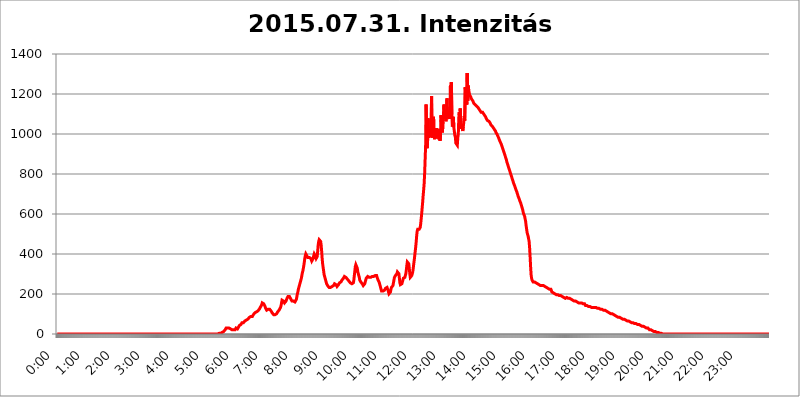
| Category | 2015.07.31. Intenzitás [W/m^2] |
|---|---|
| 0.0 | 0 |
| 0.0006944444444444445 | 0 |
| 0.001388888888888889 | 0 |
| 0.0020833333333333333 | 0 |
| 0.002777777777777778 | 0 |
| 0.003472222222222222 | 0 |
| 0.004166666666666667 | 0 |
| 0.004861111111111111 | 0 |
| 0.005555555555555556 | 0 |
| 0.0062499999999999995 | 0 |
| 0.006944444444444444 | 0 |
| 0.007638888888888889 | 0 |
| 0.008333333333333333 | 0 |
| 0.009027777777777779 | 0 |
| 0.009722222222222222 | 0 |
| 0.010416666666666666 | 0 |
| 0.011111111111111112 | 0 |
| 0.011805555555555555 | 0 |
| 0.012499999999999999 | 0 |
| 0.013194444444444444 | 0 |
| 0.013888888888888888 | 0 |
| 0.014583333333333332 | 0 |
| 0.015277777777777777 | 0 |
| 0.015972222222222224 | 0 |
| 0.016666666666666666 | 0 |
| 0.017361111111111112 | 0 |
| 0.018055555555555557 | 0 |
| 0.01875 | 0 |
| 0.019444444444444445 | 0 |
| 0.02013888888888889 | 0 |
| 0.020833333333333332 | 0 |
| 0.02152777777777778 | 0 |
| 0.022222222222222223 | 0 |
| 0.02291666666666667 | 0 |
| 0.02361111111111111 | 0 |
| 0.024305555555555556 | 0 |
| 0.024999999999999998 | 0 |
| 0.025694444444444447 | 0 |
| 0.02638888888888889 | 0 |
| 0.027083333333333334 | 0 |
| 0.027777777777777776 | 0 |
| 0.02847222222222222 | 0 |
| 0.029166666666666664 | 0 |
| 0.029861111111111113 | 0 |
| 0.030555555555555555 | 0 |
| 0.03125 | 0 |
| 0.03194444444444445 | 0 |
| 0.03263888888888889 | 0 |
| 0.03333333333333333 | 0 |
| 0.034027777777777775 | 0 |
| 0.034722222222222224 | 0 |
| 0.035416666666666666 | 0 |
| 0.036111111111111115 | 0 |
| 0.03680555555555556 | 0 |
| 0.0375 | 0 |
| 0.03819444444444444 | 0 |
| 0.03888888888888889 | 0 |
| 0.03958333333333333 | 0 |
| 0.04027777777777778 | 0 |
| 0.04097222222222222 | 0 |
| 0.041666666666666664 | 0 |
| 0.042361111111111106 | 0 |
| 0.04305555555555556 | 0 |
| 0.043750000000000004 | 0 |
| 0.044444444444444446 | 0 |
| 0.04513888888888889 | 0 |
| 0.04583333333333334 | 0 |
| 0.04652777777777778 | 0 |
| 0.04722222222222222 | 0 |
| 0.04791666666666666 | 0 |
| 0.04861111111111111 | 0 |
| 0.049305555555555554 | 0 |
| 0.049999999999999996 | 0 |
| 0.05069444444444445 | 0 |
| 0.051388888888888894 | 0 |
| 0.052083333333333336 | 0 |
| 0.05277777777777778 | 0 |
| 0.05347222222222222 | 0 |
| 0.05416666666666667 | 0 |
| 0.05486111111111111 | 0 |
| 0.05555555555555555 | 0 |
| 0.05625 | 0 |
| 0.05694444444444444 | 0 |
| 0.057638888888888885 | 0 |
| 0.05833333333333333 | 0 |
| 0.05902777777777778 | 0 |
| 0.059722222222222225 | 0 |
| 0.06041666666666667 | 0 |
| 0.061111111111111116 | 0 |
| 0.06180555555555556 | 0 |
| 0.0625 | 0 |
| 0.06319444444444444 | 0 |
| 0.06388888888888888 | 0 |
| 0.06458333333333334 | 0 |
| 0.06527777777777778 | 0 |
| 0.06597222222222222 | 0 |
| 0.06666666666666667 | 0 |
| 0.06736111111111111 | 0 |
| 0.06805555555555555 | 0 |
| 0.06874999999999999 | 0 |
| 0.06944444444444443 | 0 |
| 0.07013888888888889 | 0 |
| 0.07083333333333333 | 0 |
| 0.07152777777777779 | 0 |
| 0.07222222222222223 | 0 |
| 0.07291666666666667 | 0 |
| 0.07361111111111111 | 0 |
| 0.07430555555555556 | 0 |
| 0.075 | 0 |
| 0.07569444444444444 | 0 |
| 0.0763888888888889 | 0 |
| 0.07708333333333334 | 0 |
| 0.07777777777777778 | 0 |
| 0.07847222222222222 | 0 |
| 0.07916666666666666 | 0 |
| 0.0798611111111111 | 0 |
| 0.08055555555555556 | 0 |
| 0.08125 | 0 |
| 0.08194444444444444 | 0 |
| 0.08263888888888889 | 0 |
| 0.08333333333333333 | 0 |
| 0.08402777777777777 | 0 |
| 0.08472222222222221 | 0 |
| 0.08541666666666665 | 0 |
| 0.08611111111111112 | 0 |
| 0.08680555555555557 | 0 |
| 0.08750000000000001 | 0 |
| 0.08819444444444445 | 0 |
| 0.08888888888888889 | 0 |
| 0.08958333333333333 | 0 |
| 0.09027777777777778 | 0 |
| 0.09097222222222222 | 0 |
| 0.09166666666666667 | 0 |
| 0.09236111111111112 | 0 |
| 0.09305555555555556 | 0 |
| 0.09375 | 0 |
| 0.09444444444444444 | 0 |
| 0.09513888888888888 | 0 |
| 0.09583333333333333 | 0 |
| 0.09652777777777777 | 0 |
| 0.09722222222222222 | 0 |
| 0.09791666666666667 | 0 |
| 0.09861111111111111 | 0 |
| 0.09930555555555555 | 0 |
| 0.09999999999999999 | 0 |
| 0.10069444444444443 | 0 |
| 0.1013888888888889 | 0 |
| 0.10208333333333335 | 0 |
| 0.10277777777777779 | 0 |
| 0.10347222222222223 | 0 |
| 0.10416666666666667 | 0 |
| 0.10486111111111111 | 0 |
| 0.10555555555555556 | 0 |
| 0.10625 | 0 |
| 0.10694444444444444 | 0 |
| 0.1076388888888889 | 0 |
| 0.10833333333333334 | 0 |
| 0.10902777777777778 | 0 |
| 0.10972222222222222 | 0 |
| 0.1111111111111111 | 0 |
| 0.11180555555555556 | 0 |
| 0.11180555555555556 | 0 |
| 0.1125 | 0 |
| 0.11319444444444444 | 0 |
| 0.11388888888888889 | 0 |
| 0.11458333333333333 | 0 |
| 0.11527777777777777 | 0 |
| 0.11597222222222221 | 0 |
| 0.11666666666666665 | 0 |
| 0.1173611111111111 | 0 |
| 0.11805555555555557 | 0 |
| 0.11944444444444445 | 0 |
| 0.12013888888888889 | 0 |
| 0.12083333333333333 | 0 |
| 0.12152777777777778 | 0 |
| 0.12222222222222223 | 0 |
| 0.12291666666666667 | 0 |
| 0.12291666666666667 | 0 |
| 0.12361111111111112 | 0 |
| 0.12430555555555556 | 0 |
| 0.125 | 0 |
| 0.12569444444444444 | 0 |
| 0.12638888888888888 | 0 |
| 0.12708333333333333 | 0 |
| 0.16875 | 0 |
| 0.12847222222222224 | 0 |
| 0.12916666666666668 | 0 |
| 0.12986111111111112 | 0 |
| 0.13055555555555556 | 0 |
| 0.13125 | 0 |
| 0.13194444444444445 | 0 |
| 0.1326388888888889 | 0 |
| 0.13333333333333333 | 0 |
| 0.13402777777777777 | 0 |
| 0.13402777777777777 | 0 |
| 0.13472222222222222 | 0 |
| 0.13541666666666666 | 0 |
| 0.1361111111111111 | 0 |
| 0.13749999999999998 | 0 |
| 0.13819444444444443 | 0 |
| 0.1388888888888889 | 0 |
| 0.13958333333333334 | 0 |
| 0.14027777777777778 | 0 |
| 0.14097222222222222 | 0 |
| 0.14166666666666666 | 0 |
| 0.1423611111111111 | 0 |
| 0.14305555555555557 | 0 |
| 0.14375000000000002 | 0 |
| 0.14444444444444446 | 0 |
| 0.1451388888888889 | 0 |
| 0.1451388888888889 | 0 |
| 0.14652777777777778 | 0 |
| 0.14722222222222223 | 0 |
| 0.14791666666666667 | 0 |
| 0.1486111111111111 | 0 |
| 0.14930555555555555 | 0 |
| 0.15 | 0 |
| 0.15069444444444444 | 0 |
| 0.15138888888888888 | 0 |
| 0.15208333333333332 | 0 |
| 0.15277777777777776 | 0 |
| 0.15347222222222223 | 0 |
| 0.15416666666666667 | 0 |
| 0.15486111111111112 | 0 |
| 0.15555555555555556 | 0 |
| 0.15625 | 0 |
| 0.15694444444444444 | 0 |
| 0.15763888888888888 | 0 |
| 0.15833333333333333 | 0 |
| 0.15902777777777777 | 0 |
| 0.15972222222222224 | 0 |
| 0.16041666666666668 | 0 |
| 0.16111111111111112 | 0 |
| 0.16180555555555556 | 0 |
| 0.1625 | 0 |
| 0.16319444444444445 | 0 |
| 0.1638888888888889 | 0 |
| 0.16458333333333333 | 0 |
| 0.16527777777777777 | 0 |
| 0.16597222222222222 | 0 |
| 0.16666666666666666 | 0 |
| 0.1673611111111111 | 0 |
| 0.16805555555555554 | 0 |
| 0.16874999999999998 | 0 |
| 0.16944444444444443 | 0 |
| 0.17013888888888887 | 0 |
| 0.1708333333333333 | 0 |
| 0.17152777777777775 | 0 |
| 0.17222222222222225 | 0 |
| 0.1729166666666667 | 0 |
| 0.17361111111111113 | 0 |
| 0.17430555555555557 | 0 |
| 0.17500000000000002 | 0 |
| 0.17569444444444446 | 0 |
| 0.1763888888888889 | 0 |
| 0.17708333333333334 | 0 |
| 0.17777777777777778 | 0 |
| 0.17847222222222223 | 0 |
| 0.17916666666666667 | 0 |
| 0.1798611111111111 | 0 |
| 0.18055555555555555 | 0 |
| 0.18125 | 0 |
| 0.18194444444444444 | 0 |
| 0.1826388888888889 | 0 |
| 0.18333333333333335 | 0 |
| 0.1840277777777778 | 0 |
| 0.18472222222222223 | 0 |
| 0.18541666666666667 | 0 |
| 0.18611111111111112 | 0 |
| 0.18680555555555556 | 0 |
| 0.1875 | 0 |
| 0.18819444444444444 | 0 |
| 0.18888888888888888 | 0 |
| 0.18958333333333333 | 0 |
| 0.19027777777777777 | 0 |
| 0.1909722222222222 | 0 |
| 0.19166666666666665 | 0 |
| 0.19236111111111112 | 0 |
| 0.19305555555555554 | 0 |
| 0.19375 | 0 |
| 0.19444444444444445 | 0 |
| 0.1951388888888889 | 0 |
| 0.19583333333333333 | 0 |
| 0.19652777777777777 | 0 |
| 0.19722222222222222 | 0 |
| 0.19791666666666666 | 0 |
| 0.1986111111111111 | 0 |
| 0.19930555555555554 | 0 |
| 0.19999999999999998 | 0 |
| 0.20069444444444443 | 0 |
| 0.20138888888888887 | 0 |
| 0.2020833333333333 | 0 |
| 0.2027777777777778 | 0 |
| 0.2034722222222222 | 0 |
| 0.2041666666666667 | 0 |
| 0.20486111111111113 | 0 |
| 0.20555555555555557 | 0 |
| 0.20625000000000002 | 0 |
| 0.20694444444444446 | 0 |
| 0.2076388888888889 | 0 |
| 0.20833333333333334 | 0 |
| 0.20902777777777778 | 0 |
| 0.20972222222222223 | 0 |
| 0.21041666666666667 | 0 |
| 0.2111111111111111 | 0 |
| 0.21180555555555555 | 0 |
| 0.2125 | 0 |
| 0.21319444444444444 | 0 |
| 0.2138888888888889 | 0 |
| 0.21458333333333335 | 0 |
| 0.2152777777777778 | 0 |
| 0.21597222222222223 | 0 |
| 0.21666666666666667 | 0 |
| 0.21736111111111112 | 0 |
| 0.21805555555555556 | 0 |
| 0.21875 | 0 |
| 0.21944444444444444 | 0 |
| 0.22013888888888888 | 0 |
| 0.22083333333333333 | 0 |
| 0.22152777777777777 | 0 |
| 0.2222222222222222 | 0 |
| 0.22291666666666665 | 0 |
| 0.2236111111111111 | 0 |
| 0.22430555555555556 | 0 |
| 0.225 | 0 |
| 0.22569444444444445 | 0 |
| 0.2263888888888889 | 0 |
| 0.22708333333333333 | 3.525 |
| 0.22777777777777777 | 3.525 |
| 0.22847222222222222 | 3.525 |
| 0.22916666666666666 | 3.525 |
| 0.2298611111111111 | 3.525 |
| 0.23055555555555554 | 3.525 |
| 0.23124999999999998 | 7.887 |
| 0.23194444444444443 | 7.887 |
| 0.23263888888888887 | 7.887 |
| 0.2333333333333333 | 12.257 |
| 0.2340277777777778 | 12.257 |
| 0.2347222222222222 | 16.636 |
| 0.2354166666666667 | 21.024 |
| 0.23611111111111113 | 25.419 |
| 0.23680555555555557 | 29.823 |
| 0.23750000000000002 | 29.823 |
| 0.23819444444444446 | 29.823 |
| 0.2388888888888889 | 29.823 |
| 0.23958333333333334 | 29.823 |
| 0.24027777777777778 | 29.823 |
| 0.24097222222222223 | 29.823 |
| 0.24166666666666667 | 29.823 |
| 0.2423611111111111 | 25.419 |
| 0.24305555555555555 | 25.419 |
| 0.24375 | 21.024 |
| 0.24444444444444446 | 25.419 |
| 0.24513888888888888 | 21.024 |
| 0.24583333333333335 | 21.024 |
| 0.2465277777777778 | 21.024 |
| 0.24722222222222223 | 21.024 |
| 0.24791666666666667 | 21.024 |
| 0.24861111111111112 | 21.024 |
| 0.24930555555555556 | 21.024 |
| 0.25 | 25.419 |
| 0.25069444444444444 | 29.823 |
| 0.2513888888888889 | 29.823 |
| 0.2520833333333333 | 25.419 |
| 0.25277777777777777 | 25.419 |
| 0.2534722222222222 | 29.823 |
| 0.25416666666666665 | 34.234 |
| 0.2548611111111111 | 38.653 |
| 0.2555555555555556 | 43.079 |
| 0.25625000000000003 | 43.079 |
| 0.2569444444444445 | 47.511 |
| 0.2576388888888889 | 47.511 |
| 0.25833333333333336 | 51.951 |
| 0.2590277777777778 | 56.398 |
| 0.25972222222222224 | 56.398 |
| 0.2604166666666667 | 56.398 |
| 0.2611111111111111 | 56.398 |
| 0.26180555555555557 | 60.85 |
| 0.2625 | 60.85 |
| 0.26319444444444445 | 65.31 |
| 0.2638888888888889 | 65.31 |
| 0.26458333333333334 | 65.31 |
| 0.2652777777777778 | 69.775 |
| 0.2659722222222222 | 69.775 |
| 0.26666666666666666 | 74.246 |
| 0.2673611111111111 | 74.246 |
| 0.26805555555555555 | 78.722 |
| 0.26875 | 78.722 |
| 0.26944444444444443 | 83.205 |
| 0.2701388888888889 | 83.205 |
| 0.2708333333333333 | 83.205 |
| 0.27152777777777776 | 87.692 |
| 0.2722222222222222 | 87.692 |
| 0.27291666666666664 | 87.692 |
| 0.2736111111111111 | 87.692 |
| 0.2743055555555555 | 92.184 |
| 0.27499999999999997 | 96.682 |
| 0.27569444444444446 | 101.184 |
| 0.27638888888888885 | 101.184 |
| 0.27708333333333335 | 105.69 |
| 0.2777777777777778 | 110.201 |
| 0.27847222222222223 | 110.201 |
| 0.2791666666666667 | 110.201 |
| 0.2798611111111111 | 110.201 |
| 0.28055555555555556 | 114.716 |
| 0.28125 | 114.716 |
| 0.28194444444444444 | 119.235 |
| 0.2826388888888889 | 119.235 |
| 0.2833333333333333 | 123.758 |
| 0.28402777777777777 | 128.284 |
| 0.2847222222222222 | 128.284 |
| 0.28541666666666665 | 137.347 |
| 0.28611111111111115 | 141.884 |
| 0.28680555555555554 | 146.423 |
| 0.28750000000000003 | 155.509 |
| 0.2881944444444445 | 155.509 |
| 0.2888888888888889 | 155.509 |
| 0.28958333333333336 | 150.964 |
| 0.2902777777777778 | 146.423 |
| 0.29097222222222224 | 141.884 |
| 0.2916666666666667 | 137.347 |
| 0.2923611111111111 | 128.284 |
| 0.29305555555555557 | 123.758 |
| 0.29375 | 119.235 |
| 0.29444444444444445 | 119.235 |
| 0.2951388888888889 | 123.758 |
| 0.29583333333333334 | 123.758 |
| 0.2965277777777778 | 123.758 |
| 0.2972222222222222 | 123.758 |
| 0.29791666666666666 | 123.758 |
| 0.2986111111111111 | 123.758 |
| 0.29930555555555555 | 119.235 |
| 0.3 | 114.716 |
| 0.30069444444444443 | 110.201 |
| 0.3013888888888889 | 105.69 |
| 0.3020833333333333 | 101.184 |
| 0.30277777777777776 | 101.184 |
| 0.3034722222222222 | 96.682 |
| 0.30416666666666664 | 96.682 |
| 0.3048611111111111 | 96.682 |
| 0.3055555555555555 | 96.682 |
| 0.30624999999999997 | 96.682 |
| 0.3069444444444444 | 101.184 |
| 0.3076388888888889 | 101.184 |
| 0.30833333333333335 | 105.69 |
| 0.3090277777777778 | 110.201 |
| 0.30972222222222223 | 114.716 |
| 0.3104166666666667 | 114.716 |
| 0.3111111111111111 | 119.235 |
| 0.31180555555555556 | 119.235 |
| 0.3125 | 123.758 |
| 0.31319444444444444 | 132.814 |
| 0.3138888888888889 | 141.884 |
| 0.3145833333333333 | 155.509 |
| 0.31527777777777777 | 169.156 |
| 0.3159722222222222 | 173.709 |
| 0.31666666666666665 | 173.709 |
| 0.31736111111111115 | 164.605 |
| 0.31805555555555554 | 160.056 |
| 0.31875000000000003 | 155.509 |
| 0.3194444444444445 | 155.509 |
| 0.3201388888888889 | 160.056 |
| 0.32083333333333336 | 164.605 |
| 0.3215277777777778 | 169.156 |
| 0.32222222222222224 | 178.264 |
| 0.3229166666666667 | 182.82 |
| 0.3236111111111111 | 187.378 |
| 0.32430555555555557 | 191.937 |
| 0.325 | 191.937 |
| 0.32569444444444445 | 187.378 |
| 0.3263888888888889 | 187.378 |
| 0.32708333333333334 | 182.82 |
| 0.3277777777777778 | 173.709 |
| 0.3284722222222222 | 169.156 |
| 0.32916666666666666 | 164.605 |
| 0.3298611111111111 | 164.605 |
| 0.33055555555555555 | 164.605 |
| 0.33125 | 164.605 |
| 0.33194444444444443 | 160.056 |
| 0.3326388888888889 | 160.056 |
| 0.3333333333333333 | 160.056 |
| 0.3340277777777778 | 160.056 |
| 0.3347222222222222 | 164.605 |
| 0.3354166666666667 | 173.709 |
| 0.3361111111111111 | 187.378 |
| 0.3368055555555556 | 201.058 |
| 0.33749999999999997 | 210.182 |
| 0.33819444444444446 | 223.873 |
| 0.33888888888888885 | 233 |
| 0.33958333333333335 | 242.127 |
| 0.34027777777777773 | 251.251 |
| 0.34097222222222223 | 260.373 |
| 0.3416666666666666 | 269.49 |
| 0.3423611111111111 | 278.603 |
| 0.3430555555555555 | 292.259 |
| 0.34375 | 305.898 |
| 0.3444444444444445 | 314.98 |
| 0.3451388888888889 | 328.584 |
| 0.3458333333333334 | 342.162 |
| 0.34652777777777777 | 360.221 |
| 0.34722222222222227 | 378.224 |
| 0.34791666666666665 | 391.685 |
| 0.34861111111111115 | 400.638 |
| 0.34930555555555554 | 400.638 |
| 0.35000000000000003 | 391.685 |
| 0.3506944444444444 | 387.202 |
| 0.3513888888888889 | 382.715 |
| 0.3520833333333333 | 387.202 |
| 0.3527777777777778 | 387.202 |
| 0.3534722222222222 | 382.715 |
| 0.3541666666666667 | 378.224 |
| 0.3548611111111111 | 378.224 |
| 0.35555555555555557 | 378.224 |
| 0.35625 | 373.729 |
| 0.35694444444444445 | 364.728 |
| 0.3576388888888889 | 364.728 |
| 0.35833333333333334 | 369.23 |
| 0.3590277777777778 | 378.224 |
| 0.3597222222222222 | 391.685 |
| 0.36041666666666666 | 400.638 |
| 0.3611111111111111 | 405.108 |
| 0.36180555555555555 | 405.108 |
| 0.3625 | 387.202 |
| 0.36319444444444443 | 378.224 |
| 0.3638888888888889 | 378.224 |
| 0.3645833333333333 | 387.202 |
| 0.3652777777777778 | 414.035 |
| 0.3659722222222222 | 445.129 |
| 0.3666666666666667 | 462.786 |
| 0.3673611111111111 | 471.582 |
| 0.3680555555555556 | 475.972 |
| 0.36874999999999997 | 471.582 |
| 0.36944444444444446 | 462.786 |
| 0.37013888888888885 | 445.129 |
| 0.37083333333333335 | 414.035 |
| 0.37152777777777773 | 378.224 |
| 0.37222222222222223 | 351.198 |
| 0.3729166666666666 | 333.113 |
| 0.3736111111111111 | 314.98 |
| 0.3743055555555555 | 296.808 |
| 0.375 | 287.709 |
| 0.3756944444444445 | 278.603 |
| 0.3763888888888889 | 269.49 |
| 0.3770833333333334 | 260.373 |
| 0.37777777777777777 | 251.251 |
| 0.37847222222222227 | 246.689 |
| 0.37916666666666665 | 242.127 |
| 0.37986111111111115 | 242.127 |
| 0.38055555555555554 | 237.564 |
| 0.38125000000000003 | 233 |
| 0.3819444444444444 | 233 |
| 0.3826388888888889 | 233 |
| 0.3833333333333333 | 233 |
| 0.3840277777777778 | 233 |
| 0.3847222222222222 | 237.564 |
| 0.3854166666666667 | 237.564 |
| 0.3861111111111111 | 237.564 |
| 0.38680555555555557 | 242.127 |
| 0.3875 | 242.127 |
| 0.38819444444444445 | 246.689 |
| 0.3888888888888889 | 251.251 |
| 0.38958333333333334 | 255.813 |
| 0.3902777777777778 | 251.251 |
| 0.3909722222222222 | 246.689 |
| 0.39166666666666666 | 242.127 |
| 0.3923611111111111 | 237.564 |
| 0.39305555555555555 | 237.564 |
| 0.39375 | 242.127 |
| 0.39444444444444443 | 246.689 |
| 0.3951388888888889 | 251.251 |
| 0.3958333333333333 | 255.813 |
| 0.3965277777777778 | 255.813 |
| 0.3972222222222222 | 255.813 |
| 0.3979166666666667 | 260.373 |
| 0.3986111111111111 | 264.932 |
| 0.3993055555555556 | 269.49 |
| 0.39999999999999997 | 274.047 |
| 0.40069444444444446 | 274.047 |
| 0.40138888888888885 | 278.603 |
| 0.40208333333333335 | 283.156 |
| 0.40277777777777773 | 287.709 |
| 0.40347222222222223 | 287.709 |
| 0.4041666666666666 | 287.709 |
| 0.4048611111111111 | 283.156 |
| 0.4055555555555555 | 278.603 |
| 0.40625 | 278.603 |
| 0.4069444444444445 | 274.047 |
| 0.4076388888888889 | 269.49 |
| 0.4083333333333334 | 269.49 |
| 0.40902777777777777 | 264.932 |
| 0.40972222222222227 | 260.373 |
| 0.41041666666666665 | 260.373 |
| 0.41111111111111115 | 255.813 |
| 0.41180555555555554 | 255.813 |
| 0.41250000000000003 | 251.251 |
| 0.4131944444444444 | 251.251 |
| 0.4138888888888889 | 246.689 |
| 0.4145833333333333 | 251.251 |
| 0.4152777777777778 | 255.813 |
| 0.4159722222222222 | 269.49 |
| 0.4166666666666667 | 292.259 |
| 0.4173611111111111 | 314.98 |
| 0.41805555555555557 | 337.639 |
| 0.41875 | 346.682 |
| 0.41944444444444445 | 351.198 |
| 0.4201388888888889 | 342.162 |
| 0.42083333333333334 | 328.584 |
| 0.4215277777777778 | 310.44 |
| 0.4222222222222222 | 301.354 |
| 0.42291666666666666 | 292.259 |
| 0.4236111111111111 | 283.156 |
| 0.42430555555555555 | 269.49 |
| 0.425 | 264.932 |
| 0.42569444444444443 | 260.373 |
| 0.4263888888888889 | 255.813 |
| 0.4270833333333333 | 255.813 |
| 0.4277777777777778 | 251.251 |
| 0.4284722222222222 | 246.689 |
| 0.4291666666666667 | 242.127 |
| 0.4298611111111111 | 242.127 |
| 0.4305555555555556 | 246.689 |
| 0.43124999999999997 | 251.251 |
| 0.43194444444444446 | 260.373 |
| 0.43263888888888885 | 269.49 |
| 0.43333333333333335 | 278.603 |
| 0.43402777777777773 | 283.156 |
| 0.43472222222222223 | 283.156 |
| 0.4354166666666666 | 287.709 |
| 0.4361111111111111 | 283.156 |
| 0.4368055555555555 | 283.156 |
| 0.4375 | 283.156 |
| 0.4381944444444445 | 283.156 |
| 0.4388888888888889 | 283.156 |
| 0.4395833333333334 | 283.156 |
| 0.44027777777777777 | 283.156 |
| 0.44097222222222227 | 283.156 |
| 0.44166666666666665 | 287.709 |
| 0.44236111111111115 | 287.709 |
| 0.44305555555555554 | 287.709 |
| 0.44375000000000003 | 287.709 |
| 0.4444444444444444 | 287.709 |
| 0.4451388888888889 | 292.259 |
| 0.4458333333333333 | 292.259 |
| 0.4465277777777778 | 296.808 |
| 0.4472222222222222 | 292.259 |
| 0.4479166666666667 | 292.259 |
| 0.4486111111111111 | 283.156 |
| 0.44930555555555557 | 278.603 |
| 0.45 | 269.49 |
| 0.45069444444444445 | 264.932 |
| 0.4513888888888889 | 260.373 |
| 0.45208333333333334 | 251.251 |
| 0.4527777777777778 | 242.127 |
| 0.4534722222222222 | 233 |
| 0.45416666666666666 | 223.873 |
| 0.4548611111111111 | 214.746 |
| 0.45555555555555555 | 210.182 |
| 0.45625 | 210.182 |
| 0.45694444444444443 | 214.746 |
| 0.4576388888888889 | 214.746 |
| 0.4583333333333333 | 219.309 |
| 0.4590277777777778 | 219.309 |
| 0.4597222222222222 | 223.873 |
| 0.4604166666666667 | 228.436 |
| 0.4611111111111111 | 228.436 |
| 0.4618055555555556 | 233 |
| 0.46249999999999997 | 233 |
| 0.46319444444444446 | 228.436 |
| 0.46388888888888885 | 219.309 |
| 0.46458333333333335 | 210.182 |
| 0.46527777777777773 | 201.058 |
| 0.46597222222222223 | 196.497 |
| 0.4666666666666666 | 196.497 |
| 0.4673611111111111 | 210.182 |
| 0.4680555555555555 | 223.873 |
| 0.46875 | 233 |
| 0.4694444444444445 | 233 |
| 0.4701388888888889 | 237.564 |
| 0.4708333333333334 | 242.127 |
| 0.47152777777777777 | 255.813 |
| 0.47222222222222227 | 269.49 |
| 0.47291666666666665 | 283.156 |
| 0.47361111111111115 | 287.709 |
| 0.47430555555555554 | 292.259 |
| 0.47500000000000003 | 292.259 |
| 0.4756944444444444 | 292.259 |
| 0.4763888888888889 | 301.354 |
| 0.4770833333333333 | 310.44 |
| 0.4777777777777778 | 314.98 |
| 0.4784722222222222 | 314.98 |
| 0.4791666666666667 | 301.354 |
| 0.4798611111111111 | 278.603 |
| 0.48055555555555557 | 255.813 |
| 0.48125 | 246.689 |
| 0.48194444444444445 | 242.127 |
| 0.4826388888888889 | 242.127 |
| 0.48333333333333334 | 251.251 |
| 0.4840277777777778 | 260.373 |
| 0.4847222222222222 | 269.49 |
| 0.48541666666666666 | 278.603 |
| 0.4861111111111111 | 283.156 |
| 0.48680555555555555 | 283.156 |
| 0.4875 | 283.156 |
| 0.48819444444444443 | 287.709 |
| 0.4888888888888889 | 301.354 |
| 0.4895833333333333 | 319.517 |
| 0.4902777777777778 | 342.162 |
| 0.4909722222222222 | 360.221 |
| 0.4916666666666667 | 364.728 |
| 0.4923611111111111 | 360.221 |
| 0.4930555555555556 | 351.198 |
| 0.49374999999999997 | 328.584 |
| 0.49444444444444446 | 301.354 |
| 0.49513888888888885 | 283.156 |
| 0.49583333333333335 | 278.603 |
| 0.49652777777777773 | 287.709 |
| 0.49722222222222223 | 292.259 |
| 0.4979166666666666 | 301.354 |
| 0.4986111111111111 | 310.44 |
| 0.4993055555555555 | 328.584 |
| 0.5 | 351.198 |
| 0.5006944444444444 | 369.23 |
| 0.5013888888888889 | 391.685 |
| 0.5020833333333333 | 414.035 |
| 0.5027777777777778 | 436.27 |
| 0.5034722222222222 | 462.786 |
| 0.5041666666666667 | 493.475 |
| 0.5048611111111111 | 515.223 |
| 0.5055555555555555 | 523.88 |
| 0.50625 | 528.2 |
| 0.5069444444444444 | 528.2 |
| 0.5076388888888889 | 523.88 |
| 0.5083333333333333 | 523.88 |
| 0.5090277777777777 | 532.513 |
| 0.5097222222222222 | 549.704 |
| 0.5104166666666666 | 575.299 |
| 0.5111111111111112 | 600.661 |
| 0.5118055555555555 | 629.948 |
| 0.5125000000000001 | 658.909 |
| 0.5131944444444444 | 691.608 |
| 0.513888888888889 | 719.877 |
| 0.5145833333333333 | 751.803 |
| 0.5152777777777778 | 802.868 |
| 0.5159722222222222 | 802.868 |
| 0.5166666666666667 | 943.832 |
| 0.517361111111111 | 1147.086 |
| 0.5180555555555556 | 966.295 |
| 0.5187499999999999 | 928.819 |
| 0.5194444444444445 | 962.555 |
| 0.5201388888888888 | 1078.555 |
| 0.5208333333333334 | 981.244 |
| 0.5215277777777778 | 977.508 |
| 0.5222222222222223 | 1018.587 |
| 0.5229166666666667 | 984.98 |
| 0.5236111111111111 | 1014.852 |
| 0.5243055555555556 | 1007.383 |
| 0.525 | 1189.969 |
| 0.5256944444444445 | 981.244 |
| 0.5263888888888889 | 992.448 |
| 0.5270833333333333 | 1011.118 |
| 0.5277777777777778 | 1086.097 |
| 0.5284722222222222 | 999.916 |
| 0.5291666666666667 | 973.772 |
| 0.5298611111111111 | 999.916 |
| 0.5305555555555556 | 992.448 |
| 0.53125 | 977.508 |
| 0.5319444444444444 | 1029.798 |
| 0.5326388888888889 | 984.98 |
| 0.5333333333333333 | 988.714 |
| 0.5340277777777778 | 1018.587 |
| 0.5347222222222222 | 1026.06 |
| 0.5354166666666667 | 973.772 |
| 0.5361111111111111 | 1011.118 |
| 0.5368055555555555 | 966.295 |
| 0.5375 | 988.714 |
| 0.5381944444444444 | 1093.653 |
| 0.5388888888888889 | 1052.255 |
| 0.5395833333333333 | 1018.587 |
| 0.5402777777777777 | 1007.383 |
| 0.5409722222222222 | 1059.756 |
| 0.5416666666666666 | 1093.653 |
| 0.5423611111111112 | 1147.086 |
| 0.5430555555555555 | 1078.555 |
| 0.5437500000000001 | 1093.653 |
| 0.5444444444444444 | 1082.324 |
| 0.545138888888889 | 1063.51 |
| 0.5458333333333333 | 1086.097 |
| 0.5465277777777778 | 1178.177 |
| 0.5472222222222222 | 1078.555 |
| 0.5479166666666667 | 1116.426 |
| 0.548611111111111 | 1093.653 |
| 0.5493055555555556 | 1105.019 |
| 0.5499999999999999 | 1074.789 |
| 0.5506944444444445 | 1124.056 |
| 0.5513888888888888 | 1242.089 |
| 0.5520833333333334 | 1170.358 |
| 0.5527777777777778 | 1258.511 |
| 0.5534722222222223 | 1097.437 |
| 0.5541666666666667 | 1037.277 |
| 0.5548611111111111 | 1033.537 |
| 0.5555555555555556 | 1086.097 |
| 0.55625 | 1033.537 |
| 0.5569444444444445 | 1033.537 |
| 0.5576388888888889 | 992.448 |
| 0.5583333333333333 | 984.98 |
| 0.5590277777777778 | 955.071 |
| 0.5597222222222222 | 955.071 |
| 0.5604166666666667 | 951.327 |
| 0.5611111111111111 | 943.832 |
| 0.5618055555555556 | 981.244 |
| 0.5625 | 999.916 |
| 0.5631944444444444 | 1082.324 |
| 0.5638888888888889 | 1108.816 |
| 0.5645833333333333 | 1026.06 |
| 0.5652777777777778 | 1127.879 |
| 0.5659722222222222 | 1056.004 |
| 0.5666666666666667 | 1056.004 |
| 0.5673611111111111 | 1041.019 |
| 0.5680555555555555 | 1029.798 |
| 0.56875 | 1014.852 |
| 0.5694444444444444 | 1037.277 |
| 0.5701388888888889 | 1056.004 |
| 0.5708333333333333 | 1089.873 |
| 0.5715277777777777 | 1067.267 |
| 0.5722222222222222 | 1233.951 |
| 0.5729166666666666 | 1197.876 |
| 0.5736111111111112 | 1225.859 |
| 0.5743055555555555 | 1147.086 |
| 0.5750000000000001 | 1304.795 |
| 0.5756944444444444 | 1166.46 |
| 0.576388888888889 | 1242.089 |
| 0.5770833333333333 | 1221.83 |
| 0.5777777777777778 | 1205.82 |
| 0.5784722222222222 | 1193.918 |
| 0.5791666666666667 | 1189.969 |
| 0.579861111111111 | 1186.03 |
| 0.5805555555555556 | 1178.177 |
| 0.5812499999999999 | 1174.263 |
| 0.5819444444444445 | 1170.358 |
| 0.5826388888888888 | 1166.46 |
| 0.5833333333333334 | 1162.571 |
| 0.5840277777777778 | 1154.814 |
| 0.5847222222222223 | 1150.946 |
| 0.5854166666666667 | 1150.946 |
| 0.5861111111111111 | 1147.086 |
| 0.5868055555555556 | 1147.086 |
| 0.5875 | 1143.232 |
| 0.5881944444444445 | 1139.384 |
| 0.5888888888888889 | 1139.384 |
| 0.5895833333333333 | 1135.543 |
| 0.5902777777777778 | 1131.708 |
| 0.5909722222222222 | 1127.879 |
| 0.5916666666666667 | 1124.056 |
| 0.5923611111111111 | 1124.056 |
| 0.5930555555555556 | 1116.426 |
| 0.59375 | 1112.618 |
| 0.5944444444444444 | 1108.816 |
| 0.5951388888888889 | 1112.618 |
| 0.5958333333333333 | 1108.816 |
| 0.5965277777777778 | 1108.816 |
| 0.5972222222222222 | 1105.019 |
| 0.5979166666666667 | 1101.226 |
| 0.5986111111111111 | 1097.437 |
| 0.5993055555555555 | 1093.653 |
| 0.6 | 1089.873 |
| 0.6006944444444444 | 1086.097 |
| 0.6013888888888889 | 1082.324 |
| 0.6020833333333333 | 1074.789 |
| 0.6027777777777777 | 1074.789 |
| 0.6034722222222222 | 1067.267 |
| 0.6041666666666666 | 1067.267 |
| 0.6048611111111112 | 1067.267 |
| 0.6055555555555555 | 1063.51 |
| 0.6062500000000001 | 1059.756 |
| 0.6069444444444444 | 1056.004 |
| 0.607638888888889 | 1052.255 |
| 0.6083333333333333 | 1044.762 |
| 0.6090277777777778 | 1044.762 |
| 0.6097222222222222 | 1041.019 |
| 0.6104166666666667 | 1037.277 |
| 0.611111111111111 | 1033.537 |
| 0.6118055555555556 | 1029.798 |
| 0.6124999999999999 | 1026.06 |
| 0.6131944444444445 | 1022.323 |
| 0.6138888888888888 | 1018.587 |
| 0.6145833333333334 | 1014.852 |
| 0.6152777777777778 | 1007.383 |
| 0.6159722222222223 | 1003.65 |
| 0.6166666666666667 | 999.916 |
| 0.6173611111111111 | 996.182 |
| 0.6180555555555556 | 988.714 |
| 0.61875 | 984.98 |
| 0.6194444444444445 | 977.508 |
| 0.6201388888888889 | 970.034 |
| 0.6208333333333333 | 966.295 |
| 0.6215277777777778 | 958.814 |
| 0.6222222222222222 | 955.071 |
| 0.6229166666666667 | 947.58 |
| 0.6236111111111111 | 940.082 |
| 0.6243055555555556 | 932.576 |
| 0.625 | 925.06 |
| 0.6256944444444444 | 917.534 |
| 0.6263888888888889 | 909.996 |
| 0.6270833333333333 | 902.447 |
| 0.6277777777777778 | 894.885 |
| 0.6284722222222222 | 887.309 |
| 0.6291666666666667 | 879.719 |
| 0.6298611111111111 | 872.114 |
| 0.6305555555555555 | 860.676 |
| 0.63125 | 853.029 |
| 0.6319444444444444 | 845.365 |
| 0.6326388888888889 | 837.682 |
| 0.6333333333333333 | 829.981 |
| 0.6340277777777777 | 822.26 |
| 0.6347222222222222 | 814.519 |
| 0.6354166666666666 | 806.757 |
| 0.6361111111111112 | 798.974 |
| 0.6368055555555555 | 791.169 |
| 0.6375000000000001 | 787.258 |
| 0.6381944444444444 | 775.492 |
| 0.638888888888889 | 767.62 |
| 0.6395833333333333 | 759.723 |
| 0.6402777777777778 | 751.803 |
| 0.6409722222222222 | 747.834 |
| 0.6416666666666667 | 739.877 |
| 0.642361111111111 | 731.896 |
| 0.6430555555555556 | 723.889 |
| 0.6437499999999999 | 719.877 |
| 0.6444444444444445 | 711.832 |
| 0.6451388888888888 | 703.762 |
| 0.6458333333333334 | 695.666 |
| 0.6465277777777778 | 687.544 |
| 0.6472222222222223 | 683.473 |
| 0.6479166666666667 | 675.311 |
| 0.6486111111111111 | 667.123 |
| 0.6493055555555556 | 663.019 |
| 0.65 | 654.791 |
| 0.6506944444444445 | 646.537 |
| 0.6513888888888889 | 638.256 |
| 0.6520833333333333 | 629.948 |
| 0.6527777777777778 | 621.613 |
| 0.6534722222222222 | 609.062 |
| 0.6541666666666667 | 600.661 |
| 0.6548611111111111 | 596.45 |
| 0.6555555555555556 | 588.009 |
| 0.65625 | 575.299 |
| 0.6569444444444444 | 562.53 |
| 0.6576388888888889 | 541.121 |
| 0.6583333333333333 | 523.88 |
| 0.6590277777777778 | 506.542 |
| 0.6597222222222222 | 497.836 |
| 0.6604166666666667 | 489.108 |
| 0.6611111111111111 | 475.972 |
| 0.6618055555555555 | 462.786 |
| 0.6625 | 431.833 |
| 0.6631944444444444 | 387.202 |
| 0.6638888888888889 | 337.639 |
| 0.6645833333333333 | 296.808 |
| 0.6652777777777777 | 278.603 |
| 0.6659722222222222 | 269.49 |
| 0.6666666666666666 | 264.932 |
| 0.6673611111111111 | 260.373 |
| 0.6680555555555556 | 260.373 |
| 0.6687500000000001 | 260.373 |
| 0.6694444444444444 | 260.373 |
| 0.6701388888888888 | 255.813 |
| 0.6708333333333334 | 255.813 |
| 0.6715277777777778 | 255.813 |
| 0.6722222222222222 | 251.251 |
| 0.6729166666666666 | 251.251 |
| 0.6736111111111112 | 251.251 |
| 0.6743055555555556 | 251.251 |
| 0.6749999999999999 | 251.251 |
| 0.6756944444444444 | 246.689 |
| 0.6763888888888889 | 246.689 |
| 0.6770833333333334 | 246.689 |
| 0.6777777777777777 | 242.127 |
| 0.6784722222222223 | 246.689 |
| 0.6791666666666667 | 242.127 |
| 0.6798611111111111 | 242.127 |
| 0.6805555555555555 | 242.127 |
| 0.68125 | 242.127 |
| 0.6819444444444445 | 242.127 |
| 0.6826388888888889 | 237.564 |
| 0.6833333333333332 | 237.564 |
| 0.6840277777777778 | 237.564 |
| 0.6847222222222222 | 237.564 |
| 0.6854166666666667 | 233 |
| 0.686111111111111 | 233 |
| 0.6868055555555556 | 233 |
| 0.6875 | 233 |
| 0.6881944444444444 | 228.436 |
| 0.688888888888889 | 228.436 |
| 0.6895833333333333 | 228.436 |
| 0.6902777777777778 | 223.873 |
| 0.6909722222222222 | 223.873 |
| 0.6916666666666668 | 223.873 |
| 0.6923611111111111 | 223.873 |
| 0.6930555555555555 | 219.309 |
| 0.69375 | 210.182 |
| 0.6944444444444445 | 210.182 |
| 0.6951388888888889 | 205.62 |
| 0.6958333333333333 | 205.62 |
| 0.6965277777777777 | 201.058 |
| 0.6972222222222223 | 201.058 |
| 0.6979166666666666 | 201.058 |
| 0.6986111111111111 | 201.058 |
| 0.6993055555555556 | 201.058 |
| 0.7000000000000001 | 196.497 |
| 0.7006944444444444 | 196.497 |
| 0.7013888888888888 | 196.497 |
| 0.7020833333333334 | 196.497 |
| 0.7027777777777778 | 196.497 |
| 0.7034722222222222 | 196.497 |
| 0.7041666666666666 | 191.937 |
| 0.7048611111111112 | 191.937 |
| 0.7055555555555556 | 191.937 |
| 0.7062499999999999 | 191.937 |
| 0.7069444444444444 | 191.937 |
| 0.7076388888888889 | 187.378 |
| 0.7083333333333334 | 187.378 |
| 0.7090277777777777 | 187.378 |
| 0.7097222222222223 | 182.82 |
| 0.7104166666666667 | 182.82 |
| 0.7111111111111111 | 182.82 |
| 0.7118055555555555 | 182.82 |
| 0.7125 | 178.264 |
| 0.7131944444444445 | 178.264 |
| 0.7138888888888889 | 178.264 |
| 0.7145833333333332 | 182.82 |
| 0.7152777777777778 | 182.82 |
| 0.7159722222222222 | 178.264 |
| 0.7166666666666667 | 178.264 |
| 0.717361111111111 | 178.264 |
| 0.7180555555555556 | 178.264 |
| 0.71875 | 178.264 |
| 0.7194444444444444 | 178.264 |
| 0.720138888888889 | 173.709 |
| 0.7208333333333333 | 173.709 |
| 0.7215277777777778 | 173.709 |
| 0.7222222222222222 | 169.156 |
| 0.7229166666666668 | 169.156 |
| 0.7236111111111111 | 169.156 |
| 0.7243055555555555 | 164.605 |
| 0.725 | 164.605 |
| 0.7256944444444445 | 164.605 |
| 0.7263888888888889 | 164.605 |
| 0.7270833333333333 | 164.605 |
| 0.7277777777777777 | 164.605 |
| 0.7284722222222223 | 160.056 |
| 0.7291666666666666 | 160.056 |
| 0.7298611111111111 | 160.056 |
| 0.7305555555555556 | 155.509 |
| 0.7312500000000001 | 155.509 |
| 0.7319444444444444 | 155.509 |
| 0.7326388888888888 | 155.509 |
| 0.7333333333333334 | 155.509 |
| 0.7340277777777778 | 155.509 |
| 0.7347222222222222 | 155.509 |
| 0.7354166666666666 | 155.509 |
| 0.7361111111111112 | 150.964 |
| 0.7368055555555556 | 150.964 |
| 0.7374999999999999 | 150.964 |
| 0.7381944444444444 | 150.964 |
| 0.7388888888888889 | 150.964 |
| 0.7395833333333334 | 150.964 |
| 0.7402777777777777 | 150.964 |
| 0.7409722222222223 | 141.884 |
| 0.7416666666666667 | 141.884 |
| 0.7423611111111111 | 141.884 |
| 0.7430555555555555 | 141.884 |
| 0.74375 | 137.347 |
| 0.7444444444444445 | 137.347 |
| 0.7451388888888889 | 137.347 |
| 0.7458333333333332 | 137.347 |
| 0.7465277777777778 | 137.347 |
| 0.7472222222222222 | 137.347 |
| 0.7479166666666667 | 137.347 |
| 0.748611111111111 | 137.347 |
| 0.7493055555555556 | 132.814 |
| 0.75 | 132.814 |
| 0.7506944444444444 | 132.814 |
| 0.751388888888889 | 132.814 |
| 0.7520833333333333 | 132.814 |
| 0.7527777777777778 | 132.814 |
| 0.7534722222222222 | 132.814 |
| 0.7541666666666668 | 128.284 |
| 0.7548611111111111 | 128.284 |
| 0.7555555555555555 | 132.814 |
| 0.75625 | 132.814 |
| 0.7569444444444445 | 132.814 |
| 0.7576388888888889 | 128.284 |
| 0.7583333333333333 | 128.284 |
| 0.7590277777777777 | 128.284 |
| 0.7597222222222223 | 128.284 |
| 0.7604166666666666 | 128.284 |
| 0.7611111111111111 | 128.284 |
| 0.7618055555555556 | 123.758 |
| 0.7625000000000001 | 123.758 |
| 0.7631944444444444 | 123.758 |
| 0.7638888888888888 | 123.758 |
| 0.7645833333333334 | 119.235 |
| 0.7652777777777778 | 119.235 |
| 0.7659722222222222 | 119.235 |
| 0.7666666666666666 | 119.235 |
| 0.7673611111111112 | 119.235 |
| 0.7680555555555556 | 119.235 |
| 0.7687499999999999 | 114.716 |
| 0.7694444444444444 | 114.716 |
| 0.7701388888888889 | 114.716 |
| 0.7708333333333334 | 110.201 |
| 0.7715277777777777 | 110.201 |
| 0.7722222222222223 | 110.201 |
| 0.7729166666666667 | 110.201 |
| 0.7736111111111111 | 110.201 |
| 0.7743055555555555 | 105.69 |
| 0.775 | 105.69 |
| 0.7756944444444445 | 105.69 |
| 0.7763888888888889 | 101.184 |
| 0.7770833333333332 | 101.184 |
| 0.7777777777777778 | 101.184 |
| 0.7784722222222222 | 101.184 |
| 0.7791666666666667 | 101.184 |
| 0.779861111111111 | 96.682 |
| 0.7805555555555556 | 96.682 |
| 0.78125 | 96.682 |
| 0.7819444444444444 | 92.184 |
| 0.782638888888889 | 92.184 |
| 0.7833333333333333 | 92.184 |
| 0.7840277777777778 | 92.184 |
| 0.7847222222222222 | 87.692 |
| 0.7854166666666668 | 87.692 |
| 0.7861111111111111 | 87.692 |
| 0.7868055555555555 | 83.205 |
| 0.7875 | 83.205 |
| 0.7881944444444445 | 83.205 |
| 0.7888888888888889 | 83.205 |
| 0.7895833333333333 | 83.205 |
| 0.7902777777777777 | 78.722 |
| 0.7909722222222223 | 78.722 |
| 0.7916666666666666 | 78.722 |
| 0.7923611111111111 | 74.246 |
| 0.7930555555555556 | 74.246 |
| 0.7937500000000001 | 74.246 |
| 0.7944444444444444 | 74.246 |
| 0.7951388888888888 | 74.246 |
| 0.7958333333333334 | 69.775 |
| 0.7965277777777778 | 69.775 |
| 0.7972222222222222 | 69.775 |
| 0.7979166666666666 | 69.775 |
| 0.7986111111111112 | 69.775 |
| 0.7993055555555556 | 65.31 |
| 0.7999999999999999 | 65.31 |
| 0.8006944444444444 | 65.31 |
| 0.8013888888888889 | 65.31 |
| 0.8020833333333334 | 65.31 |
| 0.8027777777777777 | 60.85 |
| 0.8034722222222223 | 60.85 |
| 0.8041666666666667 | 60.85 |
| 0.8048611111111111 | 60.85 |
| 0.8055555555555555 | 56.398 |
| 0.80625 | 56.398 |
| 0.8069444444444445 | 56.398 |
| 0.8076388888888889 | 56.398 |
| 0.8083333333333332 | 56.398 |
| 0.8090277777777778 | 56.398 |
| 0.8097222222222222 | 51.951 |
| 0.8104166666666667 | 51.951 |
| 0.811111111111111 | 51.951 |
| 0.8118055555555556 | 51.951 |
| 0.8125 | 51.951 |
| 0.8131944444444444 | 47.511 |
| 0.813888888888889 | 47.511 |
| 0.8145833333333333 | 47.511 |
| 0.8152777777777778 | 47.511 |
| 0.8159722222222222 | 47.511 |
| 0.8166666666666668 | 43.079 |
| 0.8173611111111111 | 43.079 |
| 0.8180555555555555 | 43.079 |
| 0.81875 | 43.079 |
| 0.8194444444444445 | 38.653 |
| 0.8201388888888889 | 38.653 |
| 0.8208333333333333 | 38.653 |
| 0.8215277777777777 | 38.653 |
| 0.8222222222222223 | 38.653 |
| 0.8229166666666666 | 34.234 |
| 0.8236111111111111 | 34.234 |
| 0.8243055555555556 | 34.234 |
| 0.8250000000000001 | 29.823 |
| 0.8256944444444444 | 29.823 |
| 0.8263888888888888 | 29.823 |
| 0.8270833333333334 | 29.823 |
| 0.8277777777777778 | 29.823 |
| 0.8284722222222222 | 29.823 |
| 0.8291666666666666 | 25.419 |
| 0.8298611111111112 | 25.419 |
| 0.8305555555555556 | 21.024 |
| 0.8312499999999999 | 21.024 |
| 0.8319444444444444 | 21.024 |
| 0.8326388888888889 | 21.024 |
| 0.8333333333333334 | 21.024 |
| 0.8340277777777777 | 16.636 |
| 0.8347222222222223 | 16.636 |
| 0.8354166666666667 | 16.636 |
| 0.8361111111111111 | 16.636 |
| 0.8368055555555555 | 12.257 |
| 0.8375 | 12.257 |
| 0.8381944444444445 | 12.257 |
| 0.8388888888888889 | 12.257 |
| 0.8395833333333332 | 12.257 |
| 0.8402777777777778 | 12.257 |
| 0.8409722222222222 | 7.887 |
| 0.8416666666666667 | 7.887 |
| 0.842361111111111 | 7.887 |
| 0.8430555555555556 | 7.887 |
| 0.84375 | 7.887 |
| 0.8444444444444444 | 3.525 |
| 0.845138888888889 | 3.525 |
| 0.8458333333333333 | 3.525 |
| 0.8465277777777778 | 3.525 |
| 0.8472222222222222 | 3.525 |
| 0.8479166666666668 | 3.525 |
| 0.8486111111111111 | 0 |
| 0.8493055555555555 | 0 |
| 0.85 | 0 |
| 0.8506944444444445 | 0 |
| 0.8513888888888889 | 0 |
| 0.8520833333333333 | 0 |
| 0.8527777777777777 | 0 |
| 0.8534722222222223 | 0 |
| 0.8541666666666666 | 0 |
| 0.8548611111111111 | 0 |
| 0.8555555555555556 | 0 |
| 0.8562500000000001 | 0 |
| 0.8569444444444444 | 0 |
| 0.8576388888888888 | 0 |
| 0.8583333333333334 | 0 |
| 0.8590277777777778 | 0 |
| 0.8597222222222222 | 0 |
| 0.8604166666666666 | 0 |
| 0.8611111111111112 | 0 |
| 0.8618055555555556 | 0 |
| 0.8624999999999999 | 0 |
| 0.8631944444444444 | 0 |
| 0.8638888888888889 | 0 |
| 0.8645833333333334 | 0 |
| 0.8652777777777777 | 0 |
| 0.8659722222222223 | 0 |
| 0.8666666666666667 | 0 |
| 0.8673611111111111 | 0 |
| 0.8680555555555555 | 0 |
| 0.86875 | 0 |
| 0.8694444444444445 | 0 |
| 0.8701388888888889 | 0 |
| 0.8708333333333332 | 0 |
| 0.8715277777777778 | 0 |
| 0.8722222222222222 | 0 |
| 0.8729166666666667 | 0 |
| 0.873611111111111 | 0 |
| 0.8743055555555556 | 0 |
| 0.875 | 0 |
| 0.8756944444444444 | 0 |
| 0.876388888888889 | 0 |
| 0.8770833333333333 | 0 |
| 0.8777777777777778 | 0 |
| 0.8784722222222222 | 0 |
| 0.8791666666666668 | 0 |
| 0.8798611111111111 | 0 |
| 0.8805555555555555 | 0 |
| 0.88125 | 0 |
| 0.8819444444444445 | 0 |
| 0.8826388888888889 | 0 |
| 0.8833333333333333 | 0 |
| 0.8840277777777777 | 0 |
| 0.8847222222222223 | 0 |
| 0.8854166666666666 | 0 |
| 0.8861111111111111 | 0 |
| 0.8868055555555556 | 0 |
| 0.8875000000000001 | 0 |
| 0.8881944444444444 | 0 |
| 0.8888888888888888 | 0 |
| 0.8895833333333334 | 0 |
| 0.8902777777777778 | 0 |
| 0.8909722222222222 | 0 |
| 0.8916666666666666 | 0 |
| 0.8923611111111112 | 0 |
| 0.8930555555555556 | 0 |
| 0.8937499999999999 | 0 |
| 0.8944444444444444 | 0 |
| 0.8951388888888889 | 0 |
| 0.8958333333333334 | 0 |
| 0.8965277777777777 | 0 |
| 0.8972222222222223 | 0 |
| 0.8979166666666667 | 0 |
| 0.8986111111111111 | 0 |
| 0.8993055555555555 | 0 |
| 0.9 | 0 |
| 0.9006944444444445 | 0 |
| 0.9013888888888889 | 0 |
| 0.9020833333333332 | 0 |
| 0.9027777777777778 | 0 |
| 0.9034722222222222 | 0 |
| 0.9041666666666667 | 0 |
| 0.904861111111111 | 0 |
| 0.9055555555555556 | 0 |
| 0.90625 | 0 |
| 0.9069444444444444 | 0 |
| 0.907638888888889 | 0 |
| 0.9083333333333333 | 0 |
| 0.9090277777777778 | 0 |
| 0.9097222222222222 | 0 |
| 0.9104166666666668 | 0 |
| 0.9111111111111111 | 0 |
| 0.9118055555555555 | 0 |
| 0.9125 | 0 |
| 0.9131944444444445 | 0 |
| 0.9138888888888889 | 0 |
| 0.9145833333333333 | 0 |
| 0.9152777777777777 | 0 |
| 0.9159722222222223 | 0 |
| 0.9166666666666666 | 0 |
| 0.9173611111111111 | 0 |
| 0.9180555555555556 | 0 |
| 0.9187500000000001 | 0 |
| 0.9194444444444444 | 0 |
| 0.9201388888888888 | 0 |
| 0.9208333333333334 | 0 |
| 0.9215277777777778 | 0 |
| 0.9222222222222222 | 0 |
| 0.9229166666666666 | 0 |
| 0.9236111111111112 | 0 |
| 0.9243055555555556 | 0 |
| 0.9249999999999999 | 0 |
| 0.9256944444444444 | 0 |
| 0.9263888888888889 | 0 |
| 0.9270833333333334 | 0 |
| 0.9277777777777777 | 0 |
| 0.9284722222222223 | 0 |
| 0.9291666666666667 | 0 |
| 0.9298611111111111 | 0 |
| 0.9305555555555555 | 0 |
| 0.93125 | 0 |
| 0.9319444444444445 | 0 |
| 0.9326388888888889 | 0 |
| 0.9333333333333332 | 0 |
| 0.9340277777777778 | 0 |
| 0.9347222222222222 | 0 |
| 0.9354166666666667 | 0 |
| 0.936111111111111 | 0 |
| 0.9368055555555556 | 0 |
| 0.9375 | 0 |
| 0.9381944444444444 | 0 |
| 0.938888888888889 | 0 |
| 0.9395833333333333 | 0 |
| 0.9402777777777778 | 0 |
| 0.9409722222222222 | 0 |
| 0.9416666666666668 | 0 |
| 0.9423611111111111 | 0 |
| 0.9430555555555555 | 0 |
| 0.94375 | 0 |
| 0.9444444444444445 | 0 |
| 0.9451388888888889 | 0 |
| 0.9458333333333333 | 0 |
| 0.9465277777777777 | 0 |
| 0.9472222222222223 | 0 |
| 0.9479166666666666 | 0 |
| 0.9486111111111111 | 0 |
| 0.9493055555555556 | 0 |
| 0.9500000000000001 | 0 |
| 0.9506944444444444 | 0 |
| 0.9513888888888888 | 0 |
| 0.9520833333333334 | 0 |
| 0.9527777777777778 | 0 |
| 0.9534722222222222 | 0 |
| 0.9541666666666666 | 0 |
| 0.9548611111111112 | 0 |
| 0.9555555555555556 | 0 |
| 0.9562499999999999 | 0 |
| 0.9569444444444444 | 0 |
| 0.9576388888888889 | 0 |
| 0.9583333333333334 | 0 |
| 0.9590277777777777 | 0 |
| 0.9597222222222223 | 0 |
| 0.9604166666666667 | 0 |
| 0.9611111111111111 | 0 |
| 0.9618055555555555 | 0 |
| 0.9625 | 0 |
| 0.9631944444444445 | 0 |
| 0.9638888888888889 | 0 |
| 0.9645833333333332 | 0 |
| 0.9652777777777778 | 0 |
| 0.9659722222222222 | 0 |
| 0.9666666666666667 | 0 |
| 0.967361111111111 | 0 |
| 0.9680555555555556 | 0 |
| 0.96875 | 0 |
| 0.9694444444444444 | 0 |
| 0.970138888888889 | 0 |
| 0.9708333333333333 | 0 |
| 0.9715277777777778 | 0 |
| 0.9722222222222222 | 0 |
| 0.9729166666666668 | 0 |
| 0.9736111111111111 | 0 |
| 0.9743055555555555 | 0 |
| 0.975 | 0 |
| 0.9756944444444445 | 0 |
| 0.9763888888888889 | 0 |
| 0.9770833333333333 | 0 |
| 0.9777777777777777 | 0 |
| 0.9784722222222223 | 0 |
| 0.9791666666666666 | 0 |
| 0.9798611111111111 | 0 |
| 0.9805555555555556 | 0 |
| 0.9812500000000001 | 0 |
| 0.9819444444444444 | 0 |
| 0.9826388888888888 | 0 |
| 0.9833333333333334 | 0 |
| 0.9840277777777778 | 0 |
| 0.9847222222222222 | 0 |
| 0.9854166666666666 | 0 |
| 0.9861111111111112 | 0 |
| 0.9868055555555556 | 0 |
| 0.9874999999999999 | 0 |
| 0.9881944444444444 | 0 |
| 0.9888888888888889 | 0 |
| 0.9895833333333334 | 0 |
| 0.9902777777777777 | 0 |
| 0.9909722222222223 | 0 |
| 0.9916666666666667 | 0 |
| 0.9923611111111111 | 0 |
| 0.9930555555555555 | 0 |
| 0.99375 | 0 |
| 0.9944444444444445 | 0 |
| 0.9951388888888889 | 0 |
| 0.9958333333333332 | 0 |
| 0.9965277777777778 | 0 |
| 0.9972222222222222 | 0 |
| 0.9979166666666667 | 0 |
| 0.998611111111111 | 0 |
| 0.9993055555555556 | 0 |